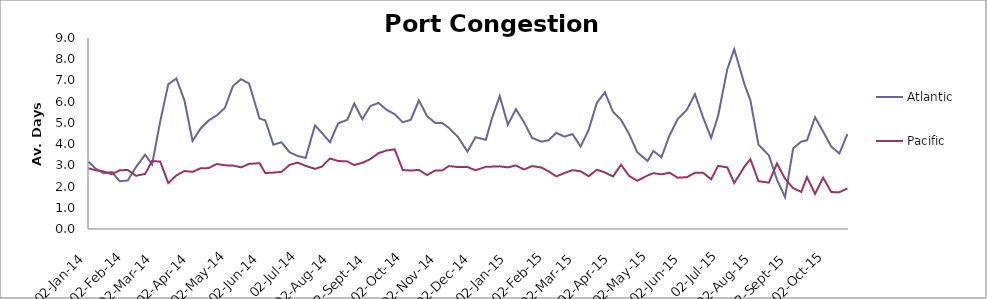
| Category | Atlantic  | Pacific |
|---|---|---|
| 2014-01-02 | 3.167 | 2.863 |
| 2014-01-08 | 2.854 | 2.767 |
| 2014-01-15 | 2.625 | 2.712 |
| 2014-01-22 | 2.688 | 2.582 |
| 2014-01-29 | 2.25 | 2.767 |
| 2014-02-05 | 2.292 | 2.781 |
| 2014-02-12 | 2.917 | 2.507 |
| 2014-02-20 | 3.5 | 2.596 |
| 2014-02-26 | 3.042 | 3.199 |
| 2014-03-05 | 5.059 | 3.178 |
| 2014-03-12 | 6.824 | 2.164 |
| 2014-03-19 | 7.088 | 2.527 |
| 2014-03-26 | 6.059 | 2.733 |
| 2014-04-02 | 4.147 | 2.692 |
| 2014-04-09 | 4.735 | 2.863 |
| 2014-04-16 | 5.118 | 2.87 |
| 2014-04-23 | 5.353 | 3.062 |
| 2014-04-30 | 5.706 | 3 |
| 2014-05-07 | 6.735 | 2.993 |
| 2014-05-14 | 7.059 | 2.904 |
| 2014-05-21 | 6.853 | 3.068 |
| 2014-05-30 | 5.206 | 3.103 |
| 2014-06-04 | 5.118 | 2.637 |
| 2014-06-11 | 3.971 | 2.658 |
| 2014-06-18 | 4.088 | 2.692 |
| 2014-06-25 | 3.618 | 3.021 |
| 2014-07-02 | 3.441 | 3.13 |
| 2014-07-09 | 3.353 | 2.973 |
| 2014-07-17 | 4.882 | 2.836 |
| 2014-07-23 | 4.529 | 2.938 |
| 2014-07-30 | 4.088 | 3.322 |
| 2014-08-06 | 4.971 | 3.205 |
| 2014-08-14 | 5.147 | 3.185 |
| 2014-08-20 | 5.912 | 3.014 |
| 2014-08-27 | 5.176 | 3.116 |
| 2014-09-03 | 5.794 | 3.295 |
| 2014-09-10 | 5.941 | 3.575 |
| 2014-09-17 | 5.618 | 3.699 |
| 2014-09-24 | 5.412 | 3.753 |
| 2014-10-01 | 5.029 | 2.781 |
| 2014-10-08 | 5.147 | 2.753 |
| 2014-10-15 | 6.059 | 2.785 |
| 2014-10-22 | 5.324 | 2.541 |
| 2014-10-29 | 5 | 2.753 |
| 2014-11-04 | 5 | 2.753 |
| 2014-11-10 | 4.765 | 2.966 |
| 2014-11-18 | 4.324 | 2.918 |
| 2014-11-26 | 3.647 | 2.925 |
| 2014-12-03 | 4.324 | 2.767 |
| 2014-12-12 | 4.206 | 2.932 |
| 2014-12-17 | 5.176 | 2.938 |
| 2014-12-24 | 6.265 | 2.952 |
| 2014-12-31 | 4.912 | 2.904 |
| 2015-01-07 | 5.647 | 2.993 |
| 2015-01-14 | 5.029 | 2.801 |
| 2015-01-21 | 4.294 | 2.966 |
| 2015-01-29 | 4.118 | 2.897 |
| 2015-02-04 | 4.176 | 2.726 |
| 2015-02-11 | 4.529 | 2.479 |
| 2015-02-18 | 4.353 | 2.637 |
| 2015-02-25 | 4.471 | 2.774 |
| 2015-03-04 | 3.882 | 2.719 |
| 2015-03-11 | 4.676 | 2.486 |
| 2015-03-18 | 5.941 | 2.795 |
| 2015-03-25 | 6.441 | 2.664 |
| 2015-04-01 | 5.529 | 2.473 |
| 2015-04-08 | 5.147 | 3.027 |
| 2015-04-15 | 4.471 | 2.5 |
| 2015-04-22 | 3.618 | 2.274 |
| 2015-05-01 | 3.206 | 2.521 |
| 2015-05-06 | 3.676 | 2.63 |
| 2015-05-13 | 3.382 | 2.575 |
| 2015-05-20 | 4.412 | 2.651 |
| 2015-05-27 | 5.176 | 2.418 |
| 2015-06-04 | 5.618 | 2.442 |
| 2015-06-11 | 6.353 | 2.645 |
| 2015-06-18 | 5.265 | 2.651 |
| 2015-06-25 | 4.294 | 2.342 |
| 2015-07-01 | 5.324 | 2.973 |
| 2015-07-09 | 7.529 | 2.904 |
| 2015-07-15 | 8.471 | 2.168 |
| 2015-07-24 | 6.794 | 2.952 |
| 2015-07-29 | 6.059 | 3.288 |
| 2015-08-05 | 3.971 | 2.253 |
| 2015-08-14 | 3.471 | 2.185 |
| 2015-08-21 | 2.324 | 3.089 |
| 2015-08-28 | 1.5 | 2.37 |
| 2015-09-04 | 3.794 | 1.925 |
| 2015-09-11 | 4.118 | 1.747 |
| 2015-09-16 | 4.176 | 2.445 |
| 2015-09-23 | 5.265 | 1.658 |
| 2015-09-30 | 4.588 | 2.418 |
| 2015-10-07 | 3.882 | 1.74 |
| 2015-10-14 | 3.559 | 1.733 |
| 2015-10-21 | 4.471 | 1.911 |